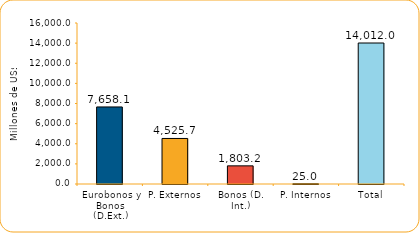
| Category | Series 1 |
|---|---|
| Eurobonos y Bonos (D.Ext.) | 7658.1 |
| P. Externos | 4525.7 |
| Bonos (D. Int.) | 1803.2 |
| P. Internos | 25 |
| Total | 14012 |